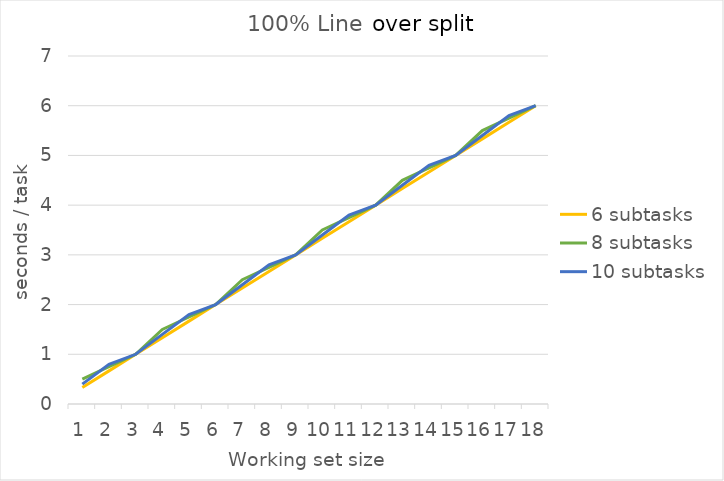
| Category | 6 subtasks | 8 subtasks | 10 subtasks |
|---|---|---|---|
| 0 | 0.333 | 0.5 | 0.4 |
| 1 | 0.667 | 0.75 | 0.8 |
| 2 | 1 | 1 | 1 |
| 3 | 1.333 | 1.5 | 1.4 |
| 4 | 1.667 | 1.75 | 1.8 |
| 5 | 2 | 2 | 2 |
| 6 | 2.333 | 2.5 | 2.4 |
| 7 | 2.667 | 2.75 | 2.8 |
| 8 | 3 | 3 | 3 |
| 9 | 3.333 | 3.5 | 3.4 |
| 10 | 3.667 | 3.75 | 3.8 |
| 11 | 4 | 4 | 4 |
| 12 | 4.333 | 4.5 | 4.4 |
| 13 | 4.667 | 4.75 | 4.8 |
| 14 | 5 | 5 | 5 |
| 15 | 5.333 | 5.5 | 5.4 |
| 16 | 5.667 | 5.75 | 5.8 |
| 17 | 6 | 6 | 6 |